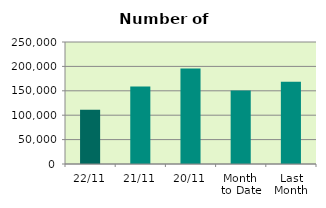
| Category | Series 0 |
|---|---|
| 22/11 | 111400 |
| 21/11 | 158984 |
| 20/11 | 195498 |
| Month 
to Date | 150827.5 |
| Last
Month | 168717.043 |